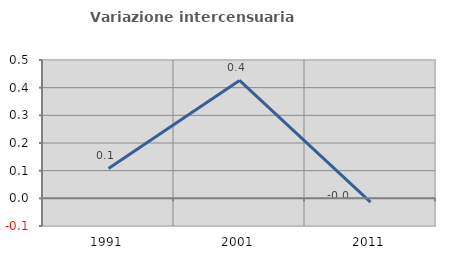
| Category | Variazione intercensuaria annua |
|---|---|
| 1991.0 | 0.108 |
| 2001.0 | 0.426 |
| 2011.0 | -0.014 |